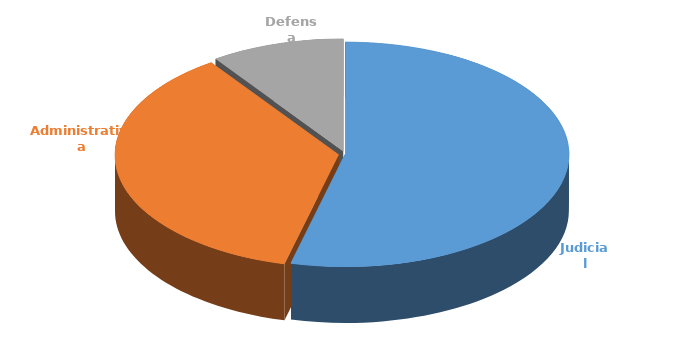
| Category | Cantidad |
|---|---|
| Judicial | 346 |
| Administrativa | 234 |
| Defensa | 62 |